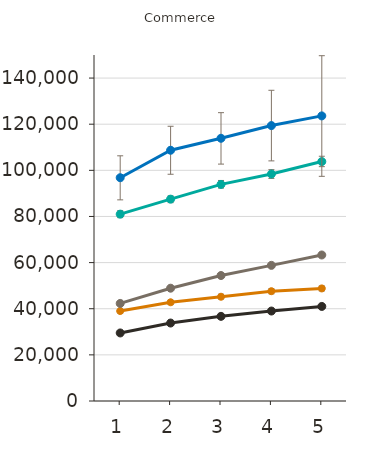
| Category | Certificat d'études collégial | Diplôme d'études collégial | Baccalauréat | Maîtrise | Doctorat | Grade professionnel |
|---|---|---|---|---|---|---|
| 1.0 | 39000 | 29500 | 42300 | 81000 | 96800 |  |
| 2.0 | 42800 | 33800 | 48900 | 87500 | 108700 |  |
| 3.0 | 45200 | 36700 | 54400 | 93900 | 113900 |  |
| 4.0 | 47600 | 39000 | 58800 | 98400 | 119400 |  |
| 5.0 | 48800 | 41000 | 63300 | 103800 | 123600 |  |